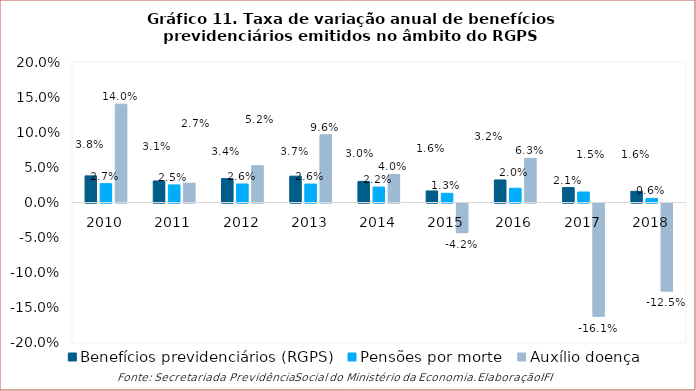
| Category | Benefícios previdenciários (RGPS) | Pensões por morte | Auxílio doença |
|---|---|---|---|
| 2010 | 0.038 | 0.027 | 0.14 |
| 2011 | 0.031 | 0.025 | 0.027 |
| 2012 | 0.034 | 0.026 | 0.052 |
| 2013 | 0.037 | 0.026 | 0.096 |
| 2014 | 0.03 | 0.022 | 0.04 |
| 2015 | 0.016 | 0.013 | -0.042 |
| 2016 | 0.032 | 0.02 | 0.063 |
| 2017 | 0.021 | 0.015 | -0.161 |
| 2018 | 0.016 | 0.006 | -0.125 |